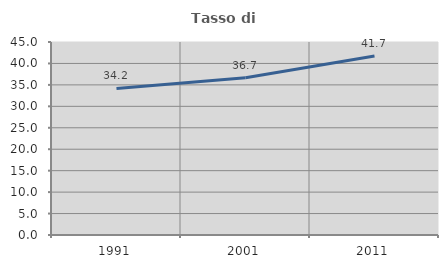
| Category | Tasso di occupazione   |
|---|---|
| 1991.0 | 34.161 |
| 2001.0 | 36.667 |
| 2011.0 | 41.727 |